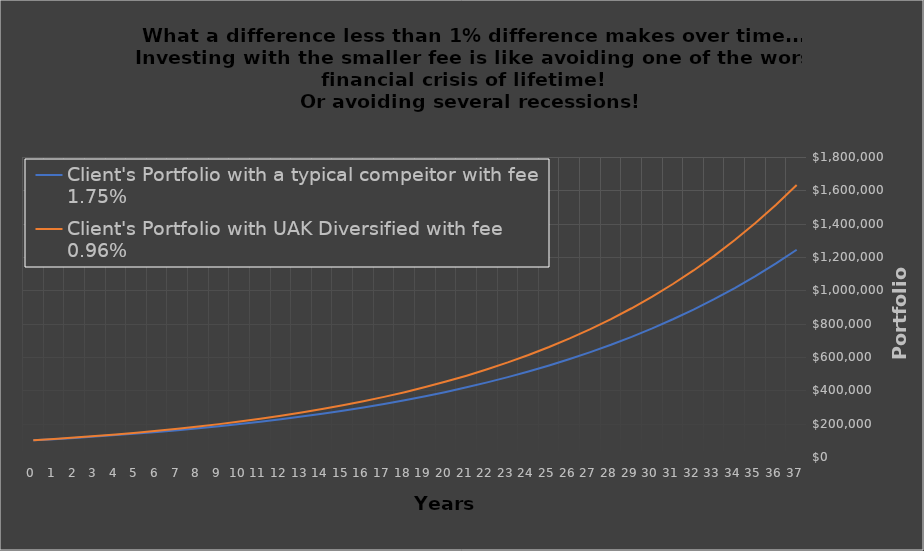
| Category | Client's Portfolio with a typical compeitor with fee 1.75% | Client's Portfolio with UAK Diversified with fee 0.96% |
|---|---|---|
| 0.0 | 100000 | 100000 |
| 1.0 | 107050 | 107840 |
| 2.0 | 114597.025 | 116294.656 |
| 3.0 | 122676.115 | 125412.157 |
| 4.0 | 131324.781 | 135244.47 |
| 5.0 | 140583.178 | 145847.637 |
| 6.0 | 150494.293 | 157282.091 |
| 7.0 | 161104.14 | 169613.007 |
| 8.0 | 172461.982 | 182910.667 |
| 9.0 | 184620.552 | 197250.863 |
| 10.0 | 197636.301 | 212715.331 |
| 11.0 | 211569.66 | 229392.213 |
| 12.0 | 226485.321 | 247376.562 |
| 13.0 | 242452.536 | 266770.885 |
| 14.0 | 259545.44 | 287685.722 |
| 15.0 | 277843.393 | 310240.283 |
| 16.0 | 297431.353 | 334563.121 |
| 17.0 | 318400.263 | 360792.87 |
| 18.0 | 340847.481 | 389079.031 |
| 19.0 | 364877.229 | 419582.827 |
| 20.0 | 390601.074 | 452478.121 |
| 21.0 | 418138.449 | 487952.405 |
| 22.0 | 447617.21 | 526207.874 |
| 23.0 | 479174.223 | 567462.571 |
| 24.0 | 512956.006 | 611951.637 |
| 25.0 | 549119.404 | 659928.645 |
| 26.0 | 587832.322 | 711667.051 |
| 27.0 | 629274.501 | 767461.747 |
| 28.0 | 673638.353 | 827630.748 |
| 29.0 | 721129.857 | 892516.999 |
| 30.0 | 771969.512 | 962490.332 |
| 31.0 | 826393.363 | 1037949.574 |
| 32.0 | 884654.095 | 1119324.82 |
| 33.0 | 947022.209 | 1207079.886 |
| 34.0 | 1013787.274 | 1301714.949 |
| 35.0 | 1085259.277 | 1403769.401 |
| 36.0 | 1161770.056 | 1513824.923 |
| 37.0 | 1243674.845 | 1632508.796 |